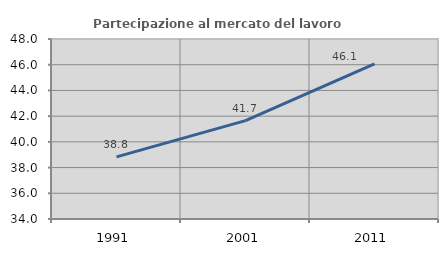
| Category | Partecipazione al mercato del lavoro  femminile |
|---|---|
| 1991.0 | 38.831 |
| 2001.0 | 41.654 |
| 2011.0 | 46.062 |